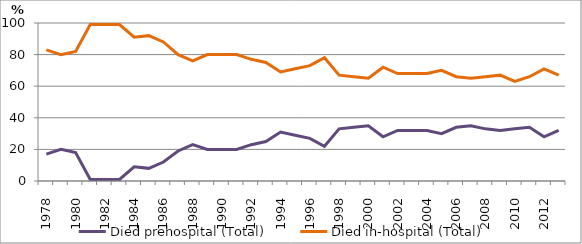
| Category | Died prehospital (Total) | Died in-hospital (Total) |
|---|---|---|
| 1978.0 | 17 | 83 |
| 1979.0 | 20 | 80 |
| 1980.0 | 18 | 82 |
| 1981.0 | 1 | 99 |
| 1982.0 | 1 | 99 |
| 1983.0 | 1 | 99 |
| 1984.0 | 9 | 91 |
| 1985.0 | 8 | 92 |
| 1986.0 | 12 | 88 |
| 1987.0 | 19 | 80 |
| 1988.0 | 23 | 76 |
| 1989.0 | 20 | 80 |
| 1990.0 | 20 | 80 |
| 1991.0 | 20 | 80 |
| 1992.0 | 23 | 77 |
| 1993.0 | 25 | 75 |
| 1994.0 | 31 | 69 |
| 1995.0 | 29 | 71 |
| 1996.0 | 27 | 73 |
| 1997.0 | 22 | 78 |
| 1998.0 | 33 | 67 |
| 1999.0 | 34 | 66 |
| 2000.0 | 35 | 65 |
| 2001.0 | 28 | 72 |
| 2002.0 | 32 | 68 |
| 2003.0 | 32 | 68 |
| 2004.0 | 32 | 68 |
| 2005.0 | 30 | 70 |
| 2006.0 | 34 | 66 |
| 2007.0 | 35 | 65 |
| 2008.0 | 33 | 66 |
| 2009.0 | 32 | 67 |
| 2010.0 | 33 | 63 |
| 2011.0 | 34 | 66 |
| 2012.0 | 28 | 71 |
| 2013.0 | 32 | 67 |